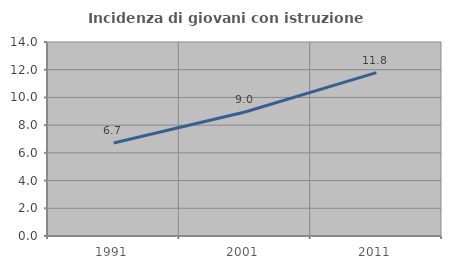
| Category | Incidenza di giovani con istruzione universitaria |
|---|---|
| 1991.0 | 6.716 |
| 2001.0 | 8.951 |
| 2011.0 | 11.786 |